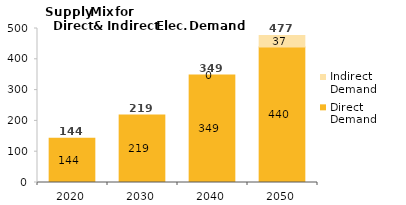
| Category | Direct Demand | Indirect Demand | Series 2 |
|---|---|---|---|
| 2020.0 | 143.877 | 0 | 143.877 |
| 2030.0 | 219.116 | 0 | 219.116 |
| 2040.0 | 348.881 | 0 | 348.881 |
| 2050.0 | 439.803 | 37.335 | 477.138 |